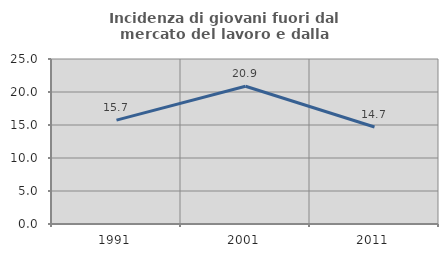
| Category | Incidenza di giovani fuori dal mercato del lavoro e dalla formazione  |
|---|---|
| 1991.0 | 15.733 |
| 2001.0 | 20.867 |
| 2011.0 | 14.69 |